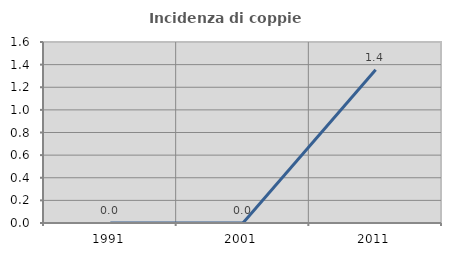
| Category | Incidenza di coppie miste |
|---|---|
| 1991.0 | 0 |
| 2001.0 | 0 |
| 2011.0 | 1.354 |